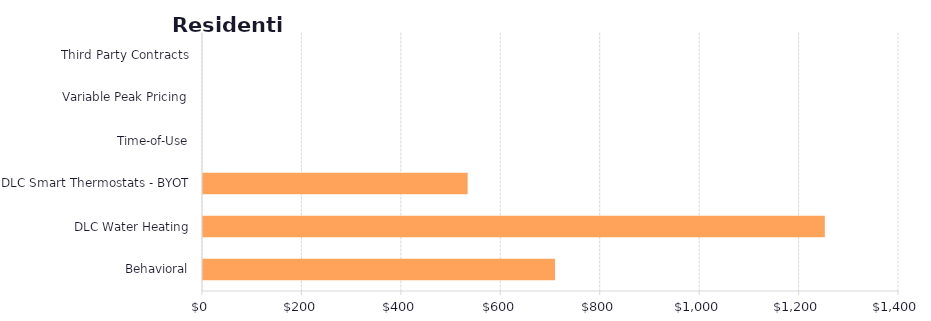
| Category | Series 1 |
|---|---|
| Behavioral | 708.002 |
| DLC Water Heating | 1250.79 |
| DLC Smart Thermostats - BYOT | 532.304 |
| Time-of-Use | 0 |
| Variable Peak Pricing | 0 |
| Third Party Contracts | 0 |